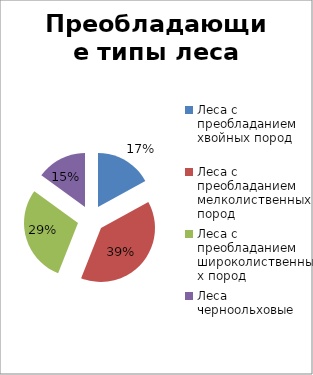
| Category | Series 0 |
|---|---|
| Леса с преобладанием хвойных пород | 17 |
| Леса с преобладанием мелколиственных пород | 39 |
| Леса с преобладанием широколиственных пород | 29 |
| Леса черноольховые | 15 |